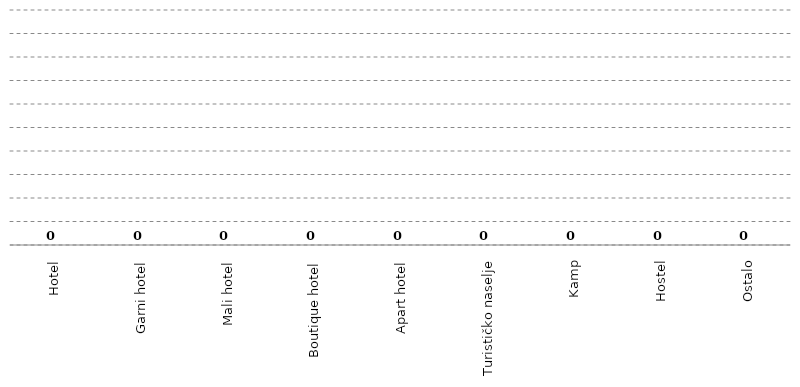
| Category | Series 0 |
|---|---|
| Hotel | 0 |
| Garni hotel | 0 |
| Mali hotel | 0 |
| Boutique hotel | 0 |
| Apart hotel | 0 |
| Turističko naselje | 0 |
| Kamp | 0 |
| Hostel | 0 |
| Ostalo | 0 |